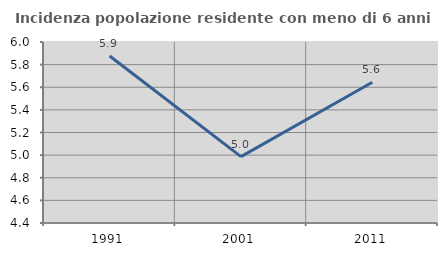
| Category | Incidenza popolazione residente con meno di 6 anni |
|---|---|
| 1991.0 | 5.876 |
| 2001.0 | 4.987 |
| 2011.0 | 5.644 |